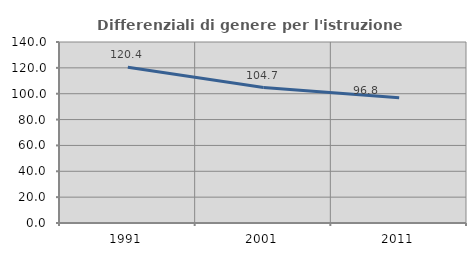
| Category | Differenziali di genere per l'istruzione superiore |
|---|---|
| 1991.0 | 120.402 |
| 2001.0 | 104.733 |
| 2011.0 | 96.832 |